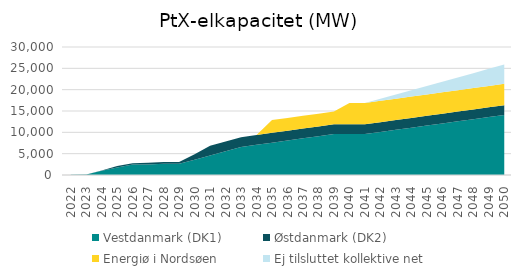
| Category | Vestdanmark (DK1) | Østdanmark (DK2) | Energiø i Nordsøen | Ej tilsluttet kollektive net |
|---|---|---|---|---|
| 2022.0 | 32 | 0 | 0 | 0 |
| 2023.0 | 116 | 10 | 0 | 0 |
| 2024.0 | 1022 | 30 | 0 | 0 |
| 2025.0 | 1762.5 | 327 | 0 | 0 |
| 2026.0 | 2450.5 | 327 | 0 | 0 |
| 2027.0 | 2450.5 | 447 | 0 | 0 |
| 2028.0 | 2625.5 | 447 | 0 | 0 |
| 2029.0 | 2625.5 | 447 | 0 | 0 |
| 2030.0 | 3587 | 1287 | 0 | 0 |
| 2031.0 | 4587 | 2287 | 0 | 0 |
| 2032.0 | 5587 | 2287 | 0 | 0 |
| 2033.0 | 6587 | 2287 | 0 | 0 |
| 2034.0 | 7087 | 2287 | 0 | 0 |
| 2035.0 | 7587 | 2287 | 3000 | 0 |
| 2036.0 | 8087 | 2287 | 3000 | 0 |
| 2037.0 | 8587 | 2287 | 3000 | 0 |
| 2038.0 | 9087 | 2287 | 3000 | 0 |
| 2039.0 | 9587 | 2287 | 3000 | 0 |
| 2040.0 | 9587 | 2287 | 5000 | 0 |
| 2041.0 | 9587 | 2287 | 5000 | 0 |
| 2042.0 | 10087 | 2287 | 5000 | 500 |
| 2043.0 | 10587 | 2287 | 5000 | 1000 |
| 2044.0 | 11087 | 2287 | 5000 | 1500 |
| 2045.0 | 11587 | 2287 | 5000 | 2000 |
| 2046.0 | 12087 | 2287 | 5000 | 2500 |
| 2047.0 | 12587 | 2287 | 5000 | 3000 |
| 2048.0 | 13087 | 2287 | 5000 | 3500 |
| 2049.0 | 13587 | 2287 | 5000 | 4000 |
| 2050.0 | 14087 | 2287 | 5000 | 4500 |